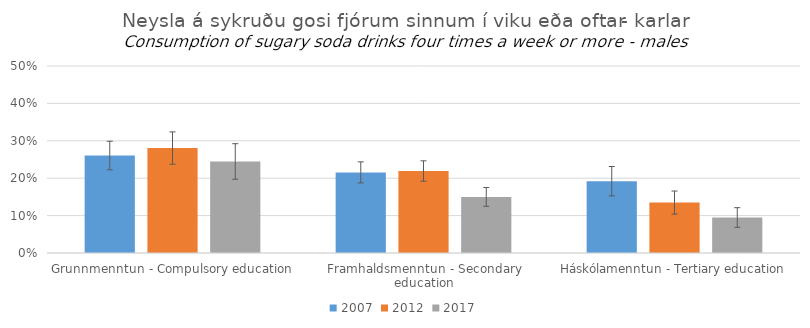
| Category | 2007 | 2012 | 2017 |
|---|---|---|---|
| Grunnmenntun - Compulsory education | 0.261 | 0.281 | 0.245 |
| Framhaldsmenntun - Secondary education | 0.216 | 0.219 | 0.15 |
| Háskólamenntun - Tertiary education | 0.192 | 0.135 | 0.095 |